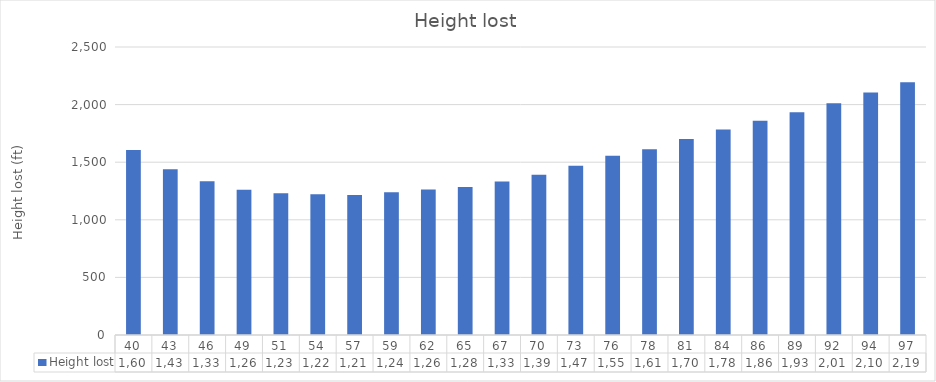
| Category | Height lost |
|---|---|
| 40.470886862826355 | 1606.299 |
| 43.16894598701478 | 1439.469 |
| 45.867005111203206 | 1333.951 |
| 48.56506423539163 | 1259.843 |
| 51.26312335958006 | 1230.833 |
| 53.961182483768475 | 1222.441 |
| 56.6592416079569 | 1214.848 |
| 59.357300732145326 | 1240.158 |
| 62.05535985633375 | 1263.266 |
| 64.75341898052217 | 1284.449 |
| 67.4514781047106 | 1332.284 |
| 70.14953722889902 | 1390.067 |
| 72.84759635308744 | 1469.816 |
| 75.54565547727587 | 1556.524 |
| 78.24371460146429 | 1612.816 |
| 80.94177372565271 | 1700.787 |
| 83.63983284984114 | 1783.084 |
| 86.33789197402956 | 1860.236 |
| 89.03595109821799 | 1932.713 |
| 91.73401022240641 | 2011.348 |
| 94.43206934659483 | 2105.737 |
| 97.13012847078326 | 2194.882 |